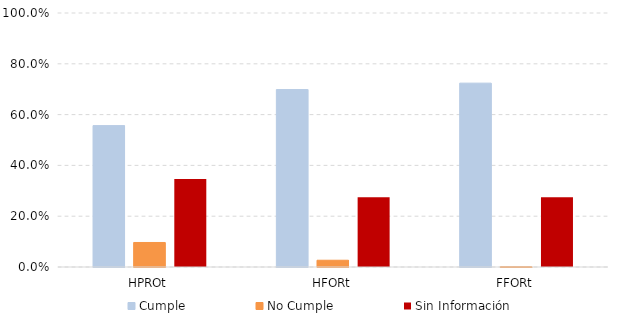
| Category | Cumple | No Cumple | Sin Información |
|---|---|---|---|
| HPROt | 0.557 | 0.096 | 0.347 |
| HFORt | 0.699 | 0.027 | 0.275 |
| FFORt | 0.724 | 0.001 | 0.275 |